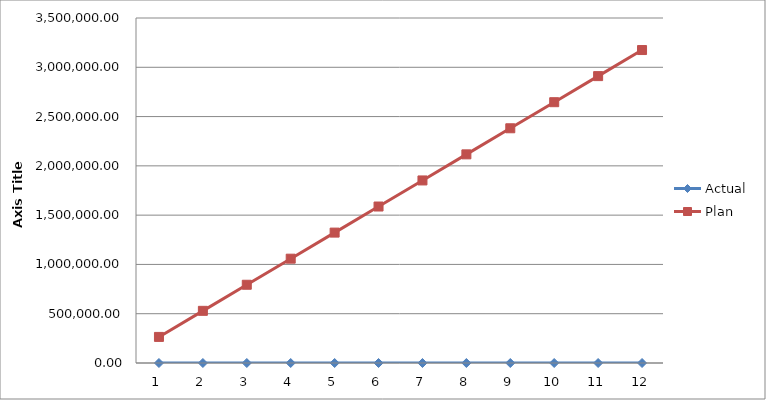
| Category | Actual | Plan |
|---|---|---|
| 0 | 0 | 264583.333 |
| 1 | 0 | 529166.667 |
| 2 | 0 | 793750 |
| 3 | 0 | 1058333.333 |
| 4 | 0 | 1322916.667 |
| 5 | 0 | 1587500 |
| 6 | 0 | 1852083.333 |
| 7 | 0 | 2116666.667 |
| 8 | 0 | 2381250 |
| 9 | 0 | 2645833.333 |
| 10 | 0 | 2910416.667 |
| 11 | 0 | 3175000 |